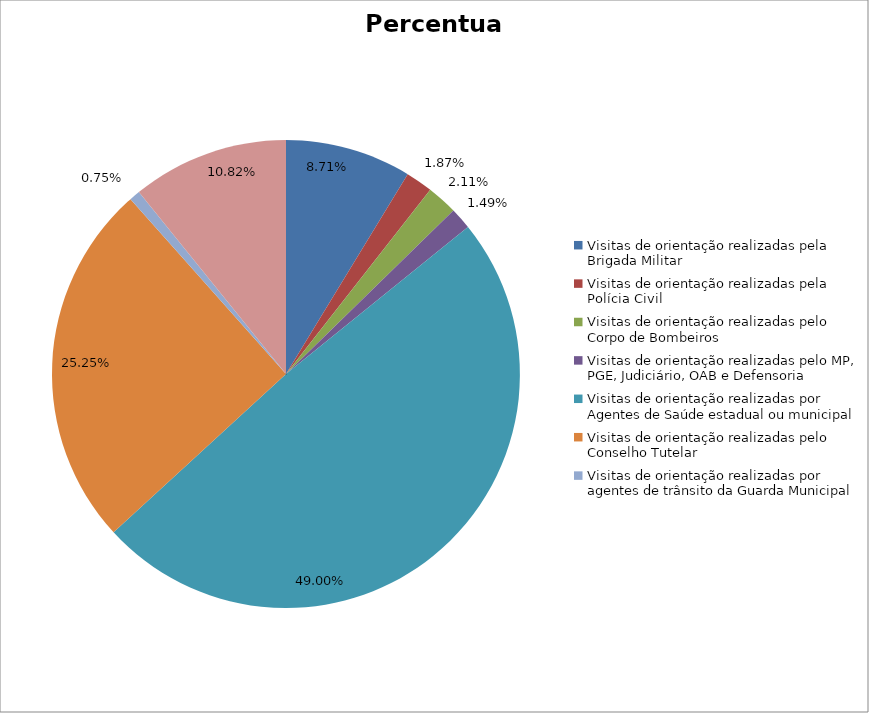
| Category | Percentual |
|---|---|
| Visitas de orientação realizadas pela Brigada Militar | 0.087 |
| Visitas de orientação realizadas pela Polícia Civil | 0.019 |
| Visitas de orientação realizadas pelo Corpo de Bombeiros | 0.021 |
| Visitas de orientação realizadas pelo MP, PGE, Judiciário, OAB e Defensoria | 0.015 |
| Visitas de orientação realizadas por Agentes de Saúde estadual ou municipal | 0.49 |
| Visitas de orientação realizadas pelo Conselho Tutelar | 0.252 |
| Visitas de orientação realizadas por agentes de trânsito da Guarda Municipal | 0.007 |
| Visitas de orientação realizadas por ONGs, entidades privadas, CRAS e CREAS | 0.108 |